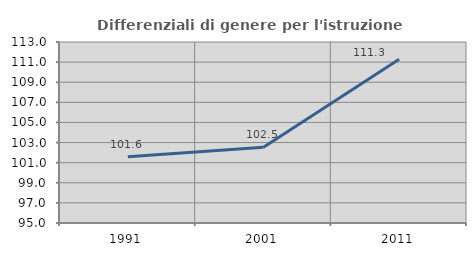
| Category | Differenziali di genere per l'istruzione superiore |
|---|---|
| 1991.0 | 101.587 |
| 2001.0 | 102.541 |
| 2011.0 | 111.278 |